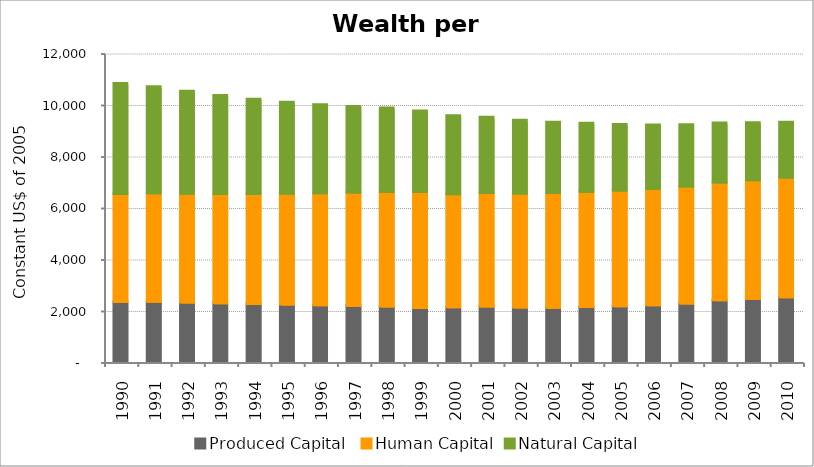
| Category | Produced Capital  | Human Capital | Natural Capital |
|---|---|---|---|
| 1990.0 | 2328.644 | 4193.509 | 4297.275 |
| 1991.0 | 2340.18 | 4210.345 | 4139.188 |
| 1992.0 | 2308.305 | 4229.414 | 3973.478 |
| 1993.0 | 2277.876 | 4250.907 | 3821.764 |
| 1994.0 | 2253.295 | 4274.803 | 3679.952 |
| 1995.0 | 2229.391 | 4300.954 | 3555.893 |
| 1996.0 | 2203.76 | 4346.524 | 3440.228 |
| 1997.0 | 2181.158 | 4396.959 | 3342.211 |
| 1998.0 | 2154.941 | 4450.566 | 3254.136 |
| 1999.0 | 2092.393 | 4504.841 | 3147.106 |
| 2000.0 | 2128.145 | 4387.138 | 3050.708 |
| 2001.0 | 2153.914 | 4411.63 | 2943.001 |
| 2002.0 | 2111.7 | 4433.463 | 2841.356 |
| 2003.0 | 2108.694 | 4453.555 | 2748.802 |
| 2004.0 | 2136.967 | 4472.887 | 2663.938 |
| 2005.0 | 2166.158 | 4491.119 | 2562.384 |
| 2006.0 | 2207.836 | 4513.117 | 2478.459 |
| 2007.0 | 2274.714 | 4544.939 | 2389.861 |
| 2008.0 | 2393.208 | 4577.773 | 2311.288 |
| 2009.0 | 2447.615 | 4611.412 | 2231.803 |
| 2010.0 | 2514.741 | 4646.477 | 2148.85 |